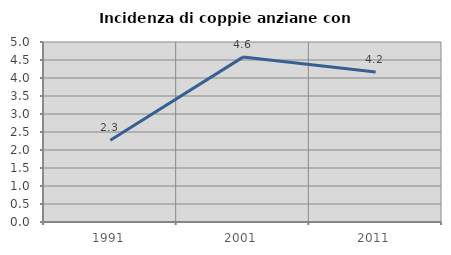
| Category | Incidenza di coppie anziane con figli |
|---|---|
| 1991.0 | 2.273 |
| 2001.0 | 4.58 |
| 2011.0 | 4.167 |